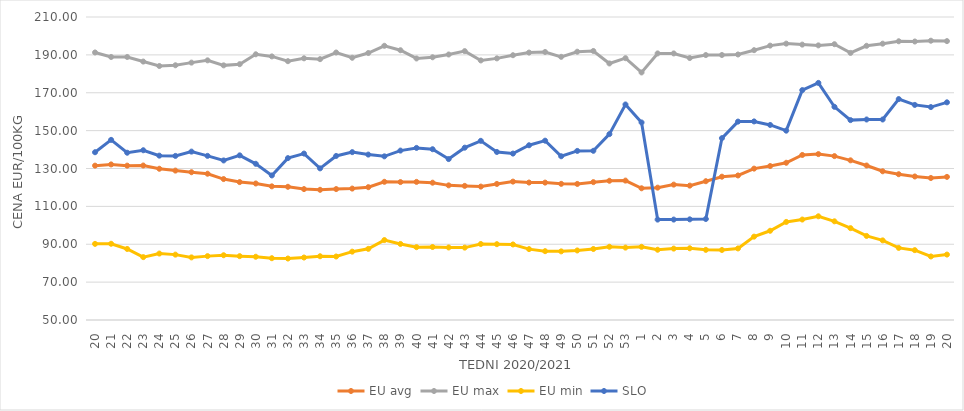
| Category | EU avg | EU max | EU min | SLO |
|---|---|---|---|---|
| 20.0 | 131.51 | 191.27 | 90.199 | 138.59 |
| 21.0 | 132.157 | 188.89 | 90.255 | 145.12 |
| 22.0 | 131.509 | 188.89 | 87.513 | 138.33 |
| 23.0 | 131.578 | 186.47 | 83.199 | 139.64 |
| 24.0 | 129.861 | 184.13 | 85.09 | 136.79 |
| 25.0 | 128.899 | 184.51 | 84.52 | 136.65 |
| 26.0 | 128.034 | 185.91 | 83.06 | 138.92 |
| 27.0 | 127.242 | 187.11 | 83.73 | 136.67 |
| 28.0 | 124.426 | 184.46 | 84.2 | 134.25 |
| 29.0 | 122.822 | 185.09 | 83.72 | 136.94 |
| 30.0 | 122.086 | 190.31 | 83.4 | 132.48 |
| 31.0 | 120.581 | 189.19 | 82.63 | 126.34 |
| 32.0 | 120.341 | 186.67 | 82.46 | 135.48 |
| 33.0 | 119.127 | 188.18 | 82.99 | 137.89 |
| 34.0 | 118.75 | 187.74 | 83.66 | 130.07 |
| 35.0 | 119.136 | 191.25 | 83.53 | 136.63 |
| 36.0 | 119.398 | 188.47 | 86.09 | 138.64 |
| 37.0 | 120.135 | 190.99 | 87.57 | 137.35 |
| 38.0 | 122.982 | 194.8 | 92.21 | 136.42 |
| 39.0 | 122.832 | 192.45 | 90.16 | 139.46 |
| 40.0 | 122.936 | 188.11 | 88.45 | 140.87 |
| 41.0 | 122.507 | 188.73 | 88.54 | 140.18 |
| 42.0 | 121.098 | 190.2 | 88.3 | 134.98 |
| 43.0 | 120.822 | 191.99 | 88.22 | 141 |
| 44.0 | 120.448 | 187.06 | 90.13 | 144.61 |
| 45.0 | 121.843 | 188.15 | 90.04 | 138.73 |
| 46.0 | 123.07 | 189.82 | 89.89 | 137.88 |
| 47.0 | 122.58 | 191.22 | 87.43 | 142.27 |
| 48.0 | 122.553 | 191.52 | 86.35 | 144.69 |
| 49.0 | 121.893 | 188.97 | 86.24 | 136.47 |
| 50.0 | 121.851 | 191.67 | 86.72 | 139.29 |
| 51.0 | 122.8 | 192.06 | 87.5 | 139.35 |
| 52.0 | 123.52 | 185.468 | 88.67 | 148.16 |
| 53.0 | 123.611 | 188.25 | 88.23 | 163.81 |
| 1.0 | 119.553 | 180.72 | 88.64 | 154.31 |
| 2.0 | 119.893 | 190.77 | 87.1 | 103.02 |
| 3.0 | 121.489 | 190.76 | 87.7 | 103.03 |
| 4.0 | 120.954 | 188.33 | 87.88 | 103.15 |
| 5.0 | 123.293 | 189.91 | 87.04 | 103.34 |
| 6.0 | 125.679 | 189.94 | 86.97 | 146.03 |
| 7.0 | 126.326 | 190.21 | 87.79 | 154.77 |
| 8.0 | 129.933 | 192.48 | 94.02 | 154.86 |
| 9.0 | 131.295 | 194.884 | 97.12 | 153 |
| 10.0 | 133.026 | 195.94 | 101.79 | 149.98 |
| 11.0 | 137.152 | 195.419 | 103.05 | 171.4 |
| 12.0 | 137.599 | 195.013 | 104.76 | 175.2 |
| 13.0 | 136.546 | 195.64 | 102.11 | 162.57 |
| 14.0 | 134.308 | 191.034 | 98.5 | 155.55 |
| 15.0 | 131.575 | 194.79 | 94.39 | 155.88 |
| 16.0 | 128.53 | 195.913 | 92.04 | 155.88 |
| 17.0 | 126.983 | 197.188 | 88.07 | 166.66 |
| 18.0 | 125.787 | 197.055 | 86.89 | 163.58 |
| 19.0 | 124.986 | 197.478 | 83.546 | 162.44 |
| 20.0 | 125.571 | 197.263 | 84.55 | 164.94 |